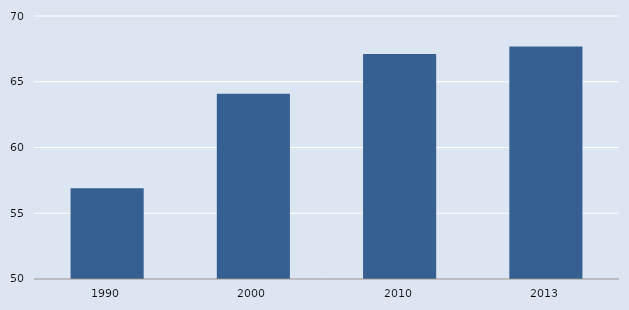
| Category | Europa |
|---|---|
| 1990.0 | 56.901 |
| 2000.0 | 64.095 |
| 2010.0 | 67.118 |
| 2013.0 | 67.686 |